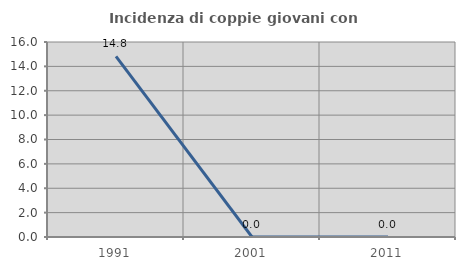
| Category | Incidenza di coppie giovani con figli |
|---|---|
| 1991.0 | 14.815 |
| 2001.0 | 0 |
| 2011.0 | 0 |